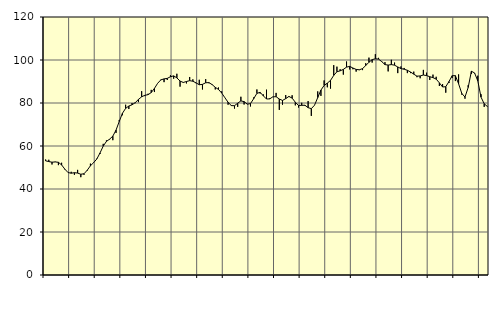
| Category | Piggar | Series 1 |
|---|---|---|
| nan | 53.7 | 53.11 |
| 87.0 | 53.6 | 52.75 |
| 87.0 | 51.4 | 52.47 |
| 87.0 | 52.7 | 52.59 |
| nan | 51.1 | 52.42 |
| 88.0 | 52.2 | 51.21 |
| 88.0 | 49.1 | 49.26 |
| 88.0 | 47.6 | 47.66 |
| nan | 48 | 47.34 |
| 89.0 | 46.6 | 47.58 |
| 89.0 | 48.9 | 47.41 |
| 89.0 | 45.5 | 46.87 |
| nan | 46.6 | 47.09 |
| 90.0 | 48.5 | 48.74 |
| 90.0 | 51.8 | 50.79 |
| 90.0 | 52.1 | 52.25 |
| nan | 54.1 | 53.95 |
| 91.0 | 56.3 | 56.77 |
| 91.0 | 61 | 59.95 |
| 91.0 | 62.6 | 62.14 |
| nan | 63 | 63.2 |
| 92.0 | 62.7 | 64.6 |
| 92.0 | 66.1 | 67.39 |
| 92.0 | 72.1 | 71.39 |
| nan | 74.3 | 75.21 |
| 93.0 | 79.2 | 77.5 |
| 93.0 | 77.2 | 78.6 |
| 93.0 | 80 | 79.16 |
| nan | 79.9 | 80.17 |
| 94.0 | 80.4 | 81.65 |
| 94.0 | 85.5 | 82.88 |
| 94.0 | 83.2 | 83.59 |
| nan | 84.3 | 83.87 |
| 95.0 | 86.1 | 84.85 |
| 95.0 | 85.1 | 86.79 |
| 95.0 | 89.2 | 89.17 |
| nan | 90.9 | 90.75 |
| 96.0 | 89.7 | 91.22 |
| 96.0 | 90.7 | 91.46 |
| 96.0 | 92.9 | 92.21 |
| nan | 91.3 | 92.62 |
| 97.0 | 93.6 | 91.69 |
| 97.0 | 87.6 | 90.2 |
| 97.0 | 89.7 | 89.55 |
| nan | 89.1 | 90 |
| 98.0 | 92.1 | 90.39 |
| 98.0 | 91 | 90.12 |
| 98.0 | 89.2 | 89.36 |
| nan | 90.8 | 88.49 |
| 99.0 | 86.3 | 88.67 |
| 99.0 | 91.1 | 89.41 |
| 99.0 | 89.2 | 89.5 |
| nan | 88.4 | 88.58 |
| 0.0 | 86.3 | 87.29 |
| 0.0 | 87.2 | 86.32 |
| 0.0 | 85.4 | 84.65 |
| nan | 82.5 | 82.47 |
| 1.0 | 79.2 | 80.34 |
| 1.0 | 79 | 78.79 |
| 1.0 | 77.4 | 78.75 |
| nan | 78.2 | 79.91 |
| 2.0 | 82.9 | 80.96 |
| 2.0 | 79.3 | 80.65 |
| 2.0 | 79.6 | 79.46 |
| nan | 78.4 | 79.72 |
| 3.0 | 82.6 | 82.02 |
| 3.0 | 86.3 | 84.48 |
| 3.0 | 84.4 | 84.96 |
| nan | 84 | 83.35 |
| 4.0 | 86.2 | 81.86 |
| 4.0 | 82.2 | 81.92 |
| 4.0 | 82.8 | 82.87 |
| nan | 84.7 | 82.92 |
| 5.0 | 76.8 | 81.85 |
| 5.0 | 79.2 | 81.19 |
| 5.0 | 83.7 | 82.03 |
| nan | 82.8 | 83.04 |
| 6.0 | 83.6 | 82.28 |
| 6.0 | 78.9 | 80.36 |
| 6.0 | 77.9 | 78.85 |
| nan | 80.1 | 78.91 |
| 7.0 | 78.7 | 78.96 |
| 7.0 | 80.9 | 77.83 |
| 7.0 | 74 | 77.37 |
| nan | 79 | 78.97 |
| 8.0 | 85.4 | 82.52 |
| 8.0 | 83.3 | 86.02 |
| 8.0 | 90.5 | 88.16 |
| nan | 87.3 | 89.24 |
| 9.0 | 86.7 | 90.51 |
| 9.0 | 97.6 | 92.83 |
| 9.0 | 96.9 | 94.53 |
| nan | 95.7 | 94.96 |
| 10.0 | 93.2 | 95.63 |
| 10.0 | 99.3 | 96.68 |
| 10.0 | 95.6 | 97.03 |
| nan | 95.7 | 96.26 |
| 11.0 | 94.6 | 95.62 |
| 11.0 | 95.3 | 95.45 |
| 11.0 | 95.3 | 95.99 |
| nan | 98.5 | 97.42 |
| 12.0 | 101.1 | 98.95 |
| 12.0 | 98.8 | 100.16 |
| 12.0 | 102.7 | 100.58 |
| nan | 101 | 100.41 |
| 13.0 | 99.1 | 99.25 |
| 13.0 | 99 | 97.86 |
| 13.0 | 94.7 | 97.64 |
| nan | 100.1 | 97.86 |
| 14.0 | 98.8 | 97.59 |
| 14.0 | 93.9 | 96.76 |
| 14.0 | 97 | 96 |
| nan | 96.3 | 95.7 |
| 15.0 | 93.9 | 95.22 |
| 15.0 | 93.9 | 94.41 |
| 15.0 | 94.6 | 93.41 |
| nan | 92 | 92.49 |
| 16.0 | 91.5 | 92.58 |
| 16.0 | 95.4 | 93.01 |
| 16.0 | 94.1 | 92.76 |
| nan | 90.7 | 92.23 |
| 17.0 | 93.2 | 91.8 |
| 17.0 | 92.2 | 91.1 |
| 17.0 | 87.9 | 89.37 |
| nan | 88.8 | 87.44 |
| 18.0 | 84.8 | 87.59 |
| 18.0 | 89.3 | 89.97 |
| 18.0 | 91.6 | 92.71 |
| nan | 90.2 | 92.71 |
| 19.0 | 93.3 | 88.94 |
| 19.0 | 83.9 | 84.46 |
| 19.0 | 82 | 82.75 |
| nan | 88.3 | 87.24 |
| 20.0 | 93.5 | 94.78 |
| 20.0 | 93.8 | 93.97 |
| 20.0 | 92.7 | 90.3 |
| nan | 84.1 | 82.74 |
| 21.0 | 78.2 | 79.65 |
| 21.0 | 78.5 | 78.37 |